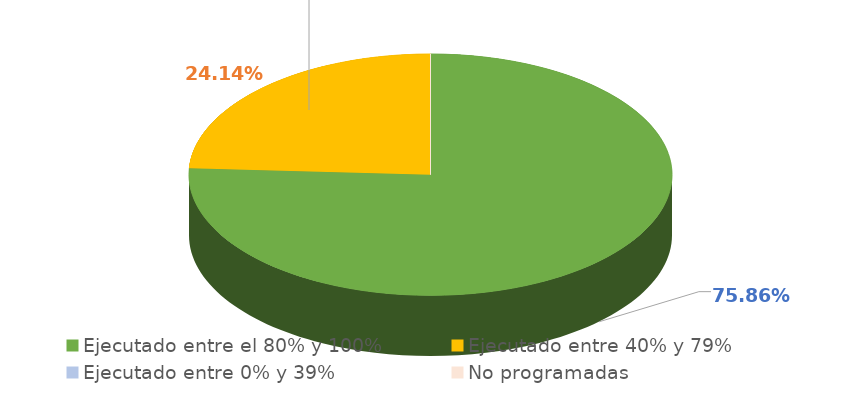
| Category | Series 0 |
|---|---|
| Ejecutado entre el 80% y 100% | 0.759 |
| Ejecutado entre 40% y 79% | 0.241 |
| Ejecutado entre 0% y 39% | 0 |
| No programadas | 0 |